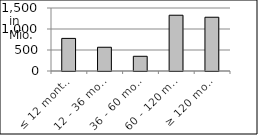
| Category | volume |
|---|---|
| ≤ 12 months | 776074056.54 |
| 12 - 36 months | 565109252.71 |
| 36 - 60 months | 350132103.21 |
| 60 - 120 months | 1327999224.781 |
| ≥ 120 months | 1279838173.221 |